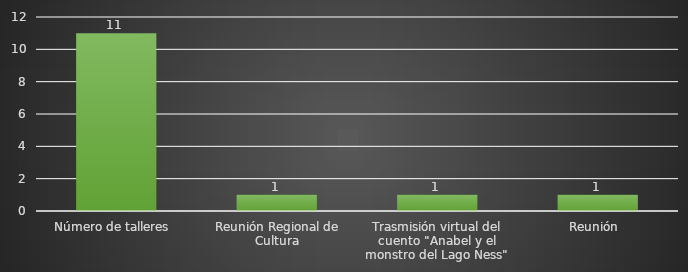
| Category | INDICADOR  |
|---|---|
| Número de talleres  | 11 |
| Reunión Regional de Cultura | 1 |
| Trasmisión virtual del cuento "Anabel y el monstro del Lago Ness" | 1 |
| Reunión  | 1 |